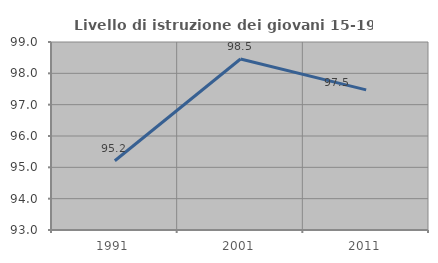
| Category | Livello di istruzione dei giovani 15-19 anni |
|---|---|
| 1991.0 | 95.211 |
| 2001.0 | 98.457 |
| 2011.0 | 97.472 |